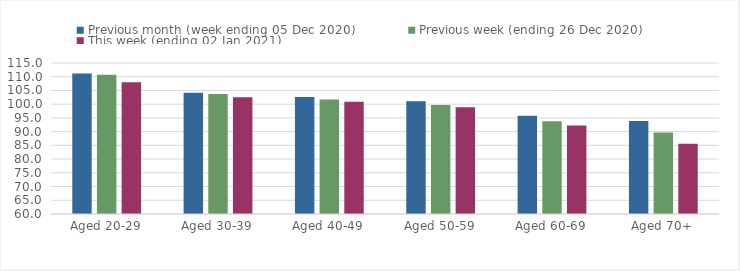
| Category | Previous month (week ending 05 Dec 2020) | Previous week (ending 26 Dec 2020) | This week (ending 02 Jan 2021) |
|---|---|---|---|
| Aged 20-29 | 111.17 | 110.72 | 108.02 |
| Aged 30-39 | 104.19 | 103.7 | 102.57 |
| Aged 40-49 | 102.6 | 101.7 | 100.93 |
| Aged 50-59 | 101.06 | 99.74 | 98.84 |
| Aged 60-69 | 95.75 | 93.79 | 92.25 |
| Aged 70+ | 93.89 | 89.66 | 85.63 |